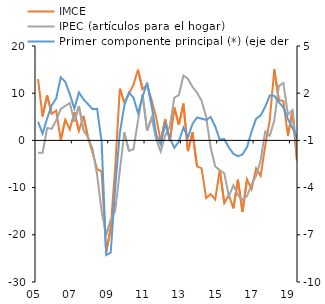
| Category | IMCE | IPEC (artículos para el hogar) |
|---|---|---|
| 2005-03-01 | 12.96 | -2.592 |
| 2005-06-01 | 5.086 | -2.639 |
| 2005-09-01 | 9.541 | 2.621 |
| 2005-12-01 | 5.669 | 2.45 |
| 2006-03-01 | 6.306 | 4.255 |
| 2006-06-01 | 0.096 | 6.663 |
| 2006-09-01 | 4.374 | 7.312 |
| 2006-12-01 | 2.34 | 7.945 |
| 2007-03-01 | 5.992 | 3.948 |
| 2007-06-01 | 2.012 | 7.276 |
| 2007-09-01 | 5.194 | 2.114 |
| 2007-12-01 | 0.635 | 0.615 |
| 2008-03-01 | -2.588 | -1.751 |
| 2008-06-01 | -6.113 | -7.281 |
| 2008-09-01 | -6.551 | -15.049 |
| 2008-12-01 | -23.714 | -20.055 |
| 2009-03-01 | -18.635 | -16.844 |
| 2009-06-01 | -5.567 | -14.835 |
| 2009-09-01 | 10.953 | -6.42 |
| 2009-12-01 | 8.015 | 1.691 |
| 2010-03-01 | 9.87 | -2.245 |
| 2010-06-01 | 11.784 | -1.856 |
| 2010-09-01 | 14.979 | 4.143 |
| 2010-12-01 | 10.848 | 9.789 |
| 2011-03-01 | 11.783 | 2.062 |
| 2011-06-01 | 8.58 | 4.798 |
| 2011-09-01 | 4.875 | 0.253 |
| 2011-12-01 | -0.118 | -2.352 |
| 2012-03-01 | 4.491 | 1.033 |
| 2012-06-01 | -0.136 | 2.963 |
| 2012-09-01 | 6.955 | 9.052 |
| 2012-12-01 | 3.284 | 9.601 |
| 2013-03-01 | 7.79 | 13.745 |
| 2013-06-01 | -2.272 | 13.045 |
| 2013-09-01 | 1.684 | 11.324 |
| 2013-12-01 | -5.513 | 10.11 |
| 2014-03-01 | -5.915 | 8.39 |
| 2014-06-01 | -12.197 | 4.996 |
| 2014-09-01 | -11.387 | -1.565 |
| 2014-12-01 | -12.513 | -5.511 |
| 2015-03-01 | -6.317 | -6.31 |
| 2015-06-01 | -13.286 | -7.01 |
| 2015-09-01 | -11.517 | -11.822 |
| 2015-12-01 | -14.398 | -9.501 |
| 2016-03-01 | -8.335 | -11.578 |
| 2016-06-01 | -15.144 | -12.577 |
| 2016-09-01 | -8.232 | -11.776 |
| 2016-12-01 | -10.313 | -9.307 |
| 2017-03-01 | -5.927 | -7.527 |
| 2017-06-01 | -7.497 | -4.175 |
| 2017-09-01 | -1.173 | 1.857 |
| 2017-12-01 | 4.362 | 0.971 |
| 2018-03-01 | 15.037 | 4.195 |
| 2018-06-01 | 8.574 | 11.533 |
| 2018-09-01 | 8.332 | 12.175 |
| 2018-12-01 | 0.964 | 5.462 |
| 2019-03-01 | 6.247 | 6.414 |
| 2019-06-01 | -4.255 | -2.222 |